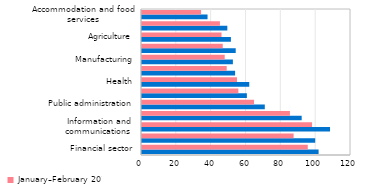
| Category | January–February 2020 | January–February 2019 |
|---|---|---|
| Financial sector | 101.406 | 95.178 |
| Energy | 99.446 | 87.045 |
| Information and communications  | 107.966 | 97.64 |
| Mining | 91.686 | 84.928 |
| Public administration | 70.507 | 64.33 |
| Education | 60.216 | 55.33 |
| Health | 61.588 | 54.529 |
| Transport and storage  | 53.458 | 48.644 |
| Manufacturing | 52.182 | 47.488 |
| Construction | 53.806 | 46.364 |
| Agriculture | 51.044 | 45.657 |
| Trade | 48.988 | 44.744 |
| Accommodation and food services | 37.63 | 33.906 |